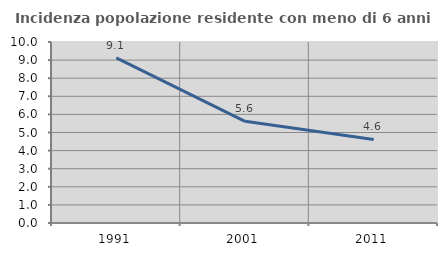
| Category | Incidenza popolazione residente con meno di 6 anni |
|---|---|
| 1991.0 | 9.12 |
| 2001.0 | 5.619 |
| 2011.0 | 4.615 |